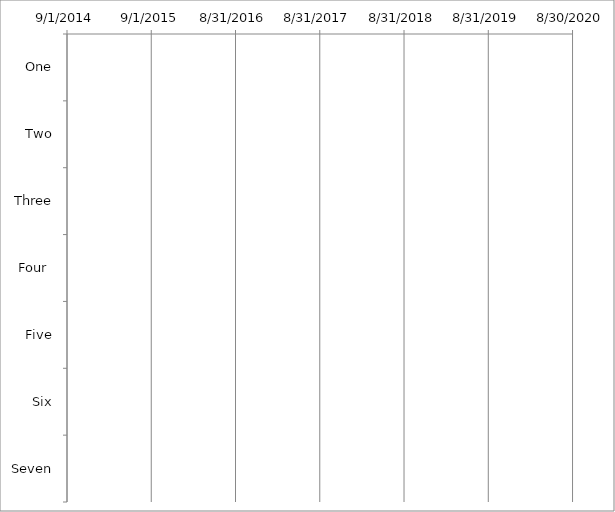
| Category | Start Date | Duration |
|---|---|---|
| One | 0 | 0 |
| Two | 0 | 0 |
| Three | 0 | 0 |
| Four  | 0 | 0 |
| Five | 0 | 0 |
| Six | 0 | 0 |
| Seven | 0 | 0 |